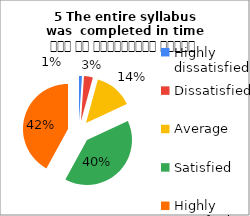
| Category | 5 The entire syllabus was  completed in time समय पर पाठ्यक्रम पूर्ण हुआ |
|---|---|
| Highly dissatisfied | 2 |
| Dissatisfied | 6 |
| Average | 26 |
| Satisfied | 75 |
| Highly satisfied | 79 |